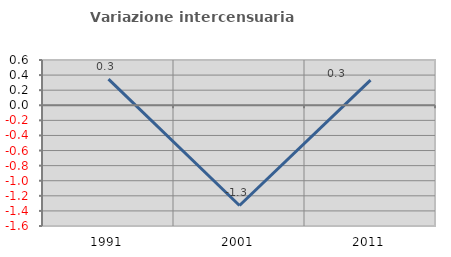
| Category | Variazione intercensuaria annua |
|---|---|
| 1991.0 | 0.346 |
| 2001.0 | -1.328 |
| 2011.0 | 0.334 |